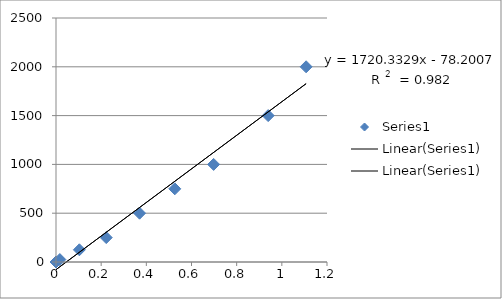
| Category | Series 0 |
|---|---|
| 0.0 | 0 |
| 0.017 | 25 |
| 0.1035 | 125 |
| 0.2225 | 250 |
| 0.37 | 500 |
| 0.526 | 750 |
| 0.698 | 1000 |
| 0.9395 | 1500 |
| 1.1075 | 2000 |